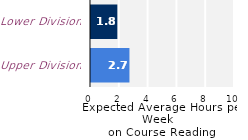
| Category | Series 0 |
|---|---|
| Upper Division | 2.67 |
| Lower Division | 1.829 |